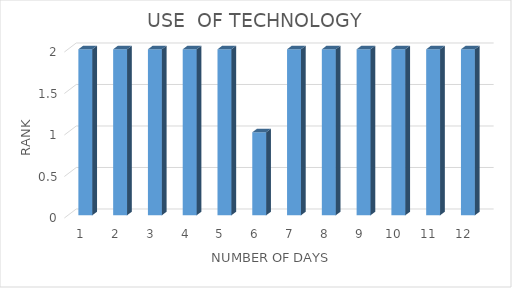
| Category | Series 0 |
|---|---|
| 0 | 2 |
| 1 | 2 |
| 2 | 2 |
| 3 | 2 |
| 4 | 2 |
| 5 | 1 |
| 6 | 2 |
| 7 | 2 |
| 8 | 2 |
| 9 | 2 |
| 10 | 2 |
| 11 | 2 |